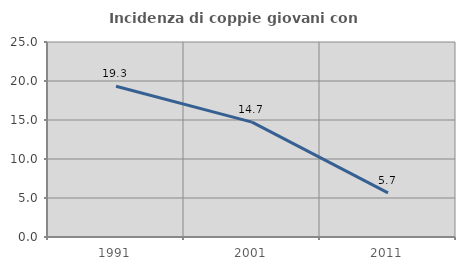
| Category | Incidenza di coppie giovani con figli |
|---|---|
| 1991.0 | 19.328 |
| 2001.0 | 14.729 |
| 2011.0 | 5.652 |